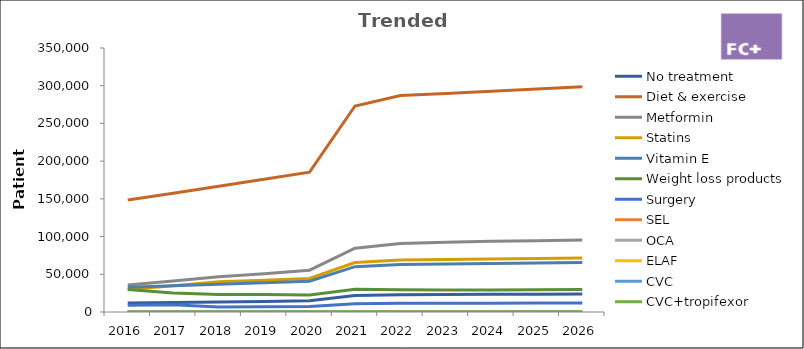
| Category | No treatment | Diet & exercise | Metformin | Statins | Vitamin E | Weight loss products | Surgery | SEL | OCA | ELAF | CVC | CVC+tropifexor |
|---|---|---|---|---|---|---|---|---|---|---|---|---|
| 2016.0 | 11880 | 148500 | 35640 | 29700 | 32670 | 29700 | 8910 | 0 | 0 | 0 | 0 | 0 |
| 2017.0 | 12598.74 | 157484.25 | 40945.905 | 34646.535 | 34646.535 | 25197.48 | 9449.055 | 0 | 0 | 0 | 0 | 0 |
| 2018.0 | 13330.667 | 166633.335 | 46657.334 | 39992 | 36659.334 | 23328.667 | 6665.333 | 0 | 0 | 0 | 0 | 0 |
| 2019.0 | 14075.972 | 175949.653 | 50628.845 | 42227.917 | 38708.924 | 23270.009 | 7037.986 | 0 | 0 | 0 | 0 | 0 |
| 2020.0 | 14834.851 | 185435.635 | 55434.988 | 44504.552 | 40795.84 | 22447.979 | 7417.425 | 0 | 0 | 0 | 0 | 0 |
| 2021.0 | 21850.499 | 273131.237 | 84525.096 | 65551.497 | 60088.872 | 30190.024 | 10925.249 | 0 | 0 | 0 | 0 | 0 |
| 2022.0 | 22951.764 | 286897.051 | 90835.61 | 68855.292 | 63117.351 | 29661.151 | 11475.882 | 0 | 0 | 0 | 0 | 0 |
| 2023.0 | 23181.282 | 289766.022 | 92462.939 | 69543.845 | 63748.525 | 29238.79 | 11590.641 | 0 | 0 | 0 | 0 | 0 |
| 2024.0 | 23413.095 | 292663.682 | 93652.378 | 70239.284 | 64386.01 | 29266.368 | 11706.547 | 0 | 0 | 0 | 0 | 0 |
| 2025.0 | 23647.225 | 295590.319 | 94588.902 | 70941.676 | 65029.87 | 29559.032 | 11823.613 | 0 | 0 | 0 | 0 | 0 |
| 2026.0 | 23883.698 | 298546.222 | 95534.791 | 71651.093 | 65680.169 | 29854.622 | 11941.849 | 0 | 0 | 0 | 0 | 0 |